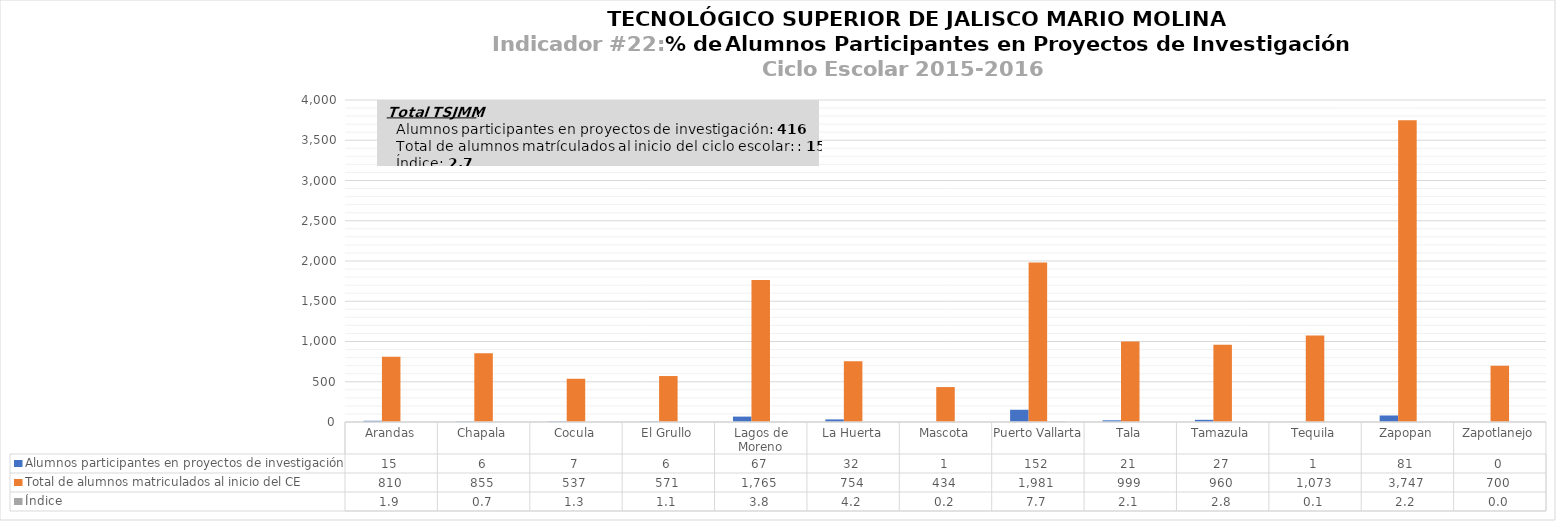
| Category | Alumnos participantes en proyectos de investigación | Total de alumnos matriculados al inicio del CE | Índice |
|---|---|---|---|
| Arandas | 15 | 810 | 1.852 |
| Chapala | 6 | 855 | 0.702 |
| Cocula | 7 | 537 | 1.304 |
| El Grullo | 6 | 571 | 1.051 |
| Lagos de Moreno | 67 | 1765 | 3.796 |
| La Huerta | 32 | 754 | 4.244 |
| Mascota | 1 | 434 | 0.23 |
| Puerto Vallarta | 152 | 1981 | 7.673 |
| Tala | 21 | 999 | 2.102 |
| Tamazula | 27 | 960 | 2.812 |
| Tequila | 1 | 1073 | 0.093 |
| Zapopan | 81 | 3747 | 2.162 |
| Zapotlanejo | 0 | 700 | 0 |